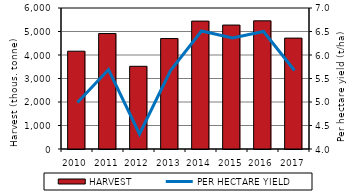
| Category | HARVEST |
|---|---|
| 2010.0 | 4161.553 |
| 2011.0 | 4913.048 |
| 2012.0 | 3518.896 |
| 2013.0 | 4700.696 |
| 2014.0 | 5442.349 |
| 2015.0 | 5274.272 |
| 2016.0 | 5454.663 |
| 2017.0 | 4718.205 |